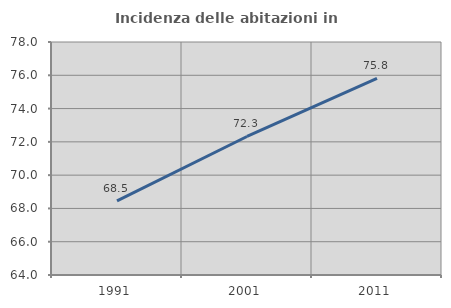
| Category | Incidenza delle abitazioni in proprietà  |
|---|---|
| 1991.0 | 68.459 |
| 2001.0 | 72.322 |
| 2011.0 | 75.821 |